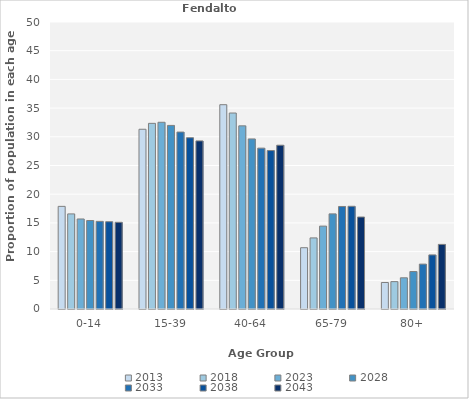
| Category | 2013 | 2018 | 2023 | 2028 | 2033 | 2038 | 2043 |
|---|---|---|---|---|---|---|---|
| 0-14 | 17.881 | 16.569 | 15.685 | 15.413 | 15.267 | 15.207 | 15.105 |
| 15-39 | 31.314 | 32.343 | 32.531 | 31.983 | 30.823 | 29.835 | 29.289 |
| 40-64 | 35.593 | 34.142 | 31.909 | 29.628 | 28.025 | 27.603 | 28.536 |
| 65-79 | 10.678 | 12.385 | 14.44 | 16.57 | 17.86 | 17.893 | 16.025 |
| 80+ | 4.619 | 4.77 | 5.436 | 6.529 | 7.819 | 9.421 | 11.255 |